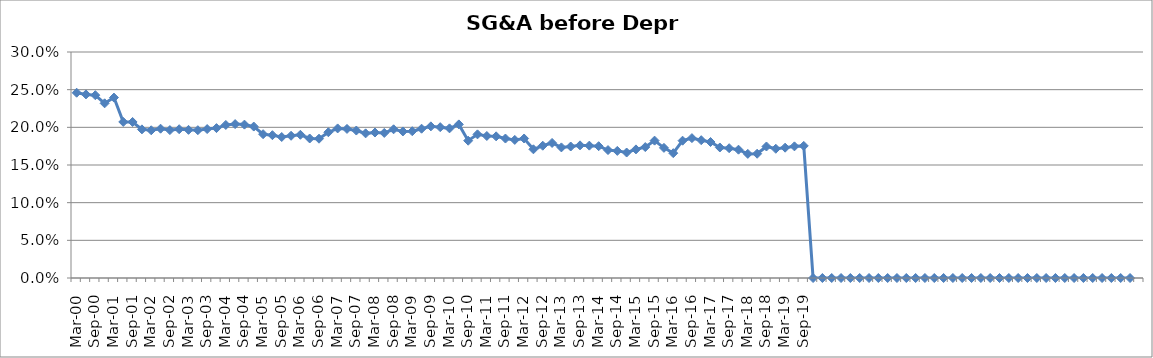
| Category | SG&A (before depr.) % |
|---|---|
| Mar-00 | 0.246 |
| Jun-00 | 0.244 |
| Sep-00 | 0.243 |
| Dec-00 | 0.232 |
| Mar-01 | 0.24 |
| Jun-01 | 0.207 |
| Sep-01 | 0.207 |
| Dec-01 | 0.197 |
| Mar-02 | 0.196 |
| Jun-02 | 0.198 |
| Sep-02 | 0.196 |
| Dec-02 | 0.198 |
| Mar-03 | 0.197 |
| Jun-03 | 0.196 |
| Sep-03 | 0.198 |
| Dec-03 | 0.199 |
| Mar-04 | 0.203 |
| Jun-04 | 0.204 |
| Sep-04 | 0.204 |
| Dec-04 | 0.201 |
| Mar-05 | 0.191 |
| Jun-05 | 0.19 |
| Sep-05 | 0.187 |
| Dec-05 | 0.189 |
| Mar-06 | 0.19 |
| Jun-06 | 0.185 |
| Sep-06 | 0.185 |
| Dec-06 | 0.193 |
| Mar-07 | 0.199 |
| Jun-07 | 0.198 |
| Sep-07 | 0.196 |
| Dec-07 | 0.192 |
| Mar-08 | 0.193 |
| Jun-08 | 0.193 |
| Sep-08 | 0.197 |
| Dec-08 | 0.195 |
| Mar-09 | 0.195 |
| Jun-09 | 0.198 |
| Sep-09 | 0.201 |
| Dec-09 | 0.2 |
| Mar-10 | 0.199 |
| Jun-10 | 0.204 |
| Sep-10 | 0.182 |
| Dec-10 | 0.191 |
| Mar-11 | 0.188 |
| Jun-11 | 0.188 |
| Sep-11 | 0.185 |
| Dec-11 | 0.183 |
| Mar-12 | 0.185 |
| Jun-12 | 0.171 |
| Sep-12 | 0.176 |
| Dec-12 | 0.179 |
| Mar-13 | 0.173 |
| Jun-13 | 0.175 |
| Sep-13 | 0.176 |
| Dec-13 | 0.176 |
| Mar-14 | 0.175 |
| Jun-14 | 0.17 |
| Sep-14 | 0.169 |
| Dec-14 | 0.167 |
| Mar-15 | 0.171 |
| Jun-15 | 0.174 |
| Sep-15 | 0.182 |
| Dec-15 | 0.173 |
| Mar-16 | 0.166 |
| Jun-16 | 0.182 |
| Sep-16 | 0.186 |
| Dec-16 | 0.183 |
| Mar-17 | 0.18 |
| Jun-17 | 0.173 |
| Sep-17 | 0.172 |
| Dec-17 | 0.17 |
| Mar-18 | 0.165 |
| Jun-18 | 0.165 |
| Sep-18 | 0.175 |
| Dec-18 | 0.172 |
| Mar-19 | 0.173 |
| Jun-19 | 0.175 |
| Sep-19 | 0.175 |